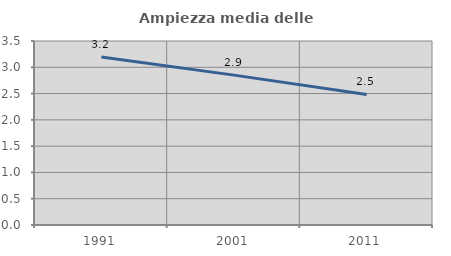
| Category | Ampiezza media delle famiglie |
|---|---|
| 1991.0 | 3.194 |
| 2001.0 | 2.851 |
| 2011.0 | 2.482 |